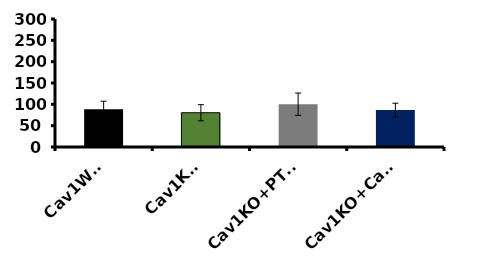
| Category | Series 0 |
|---|---|
| Cav1WT  | 88.437 |
| Cav1KO | 80.274 |
| Cav1KO+PTRF | 100.291 |
| Cav1KO+Cav1 | 86.436 |